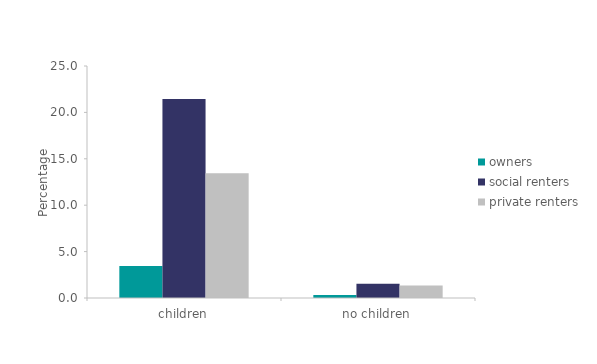
| Category | owners | social renters | private renters |
|---|---|---|---|
| children | 3.445 | 21.443 | 13.453 |
| no children | 0.332 | 1.547 | 1.336 |